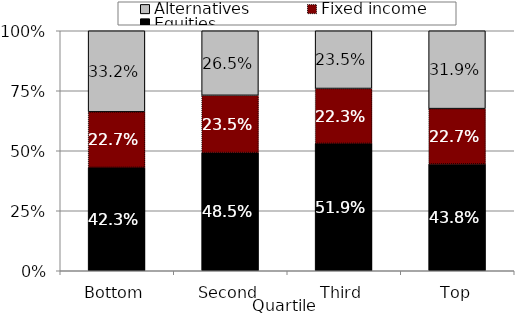
| Category | Equities | Fixed income | Alternatives |
|---|---|---|---|
| Bottom | 0.423 | 0.227 | 0.332 |
| Second | 0.485 | 0.235 | 0.265 |
| Third | 0.519 | 0.223 | 0.235 |
| Top | 0.438 | 0.227 | 0.319 |